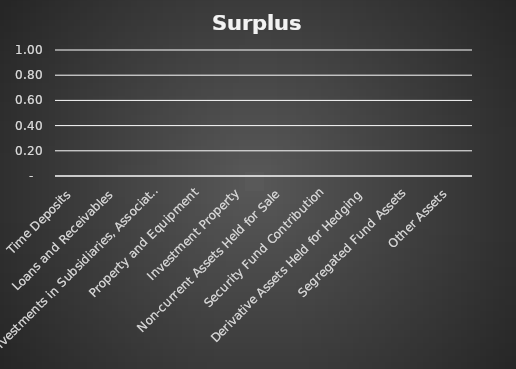
| Category | Series 3 |
|---|---|
| Time Deposits | 0 |
| Loans and Receivables | 0 |
| Investments in Subsidiaries, Associates and Joint Ventures | 0 |
| Property and Equipment | 0 |
| Investment Property | 0 |
| Non-current Assets Held for Sale | 0 |
| Security Fund Contribution | 0 |
| Derivative Assets Held for Hedging | 0 |
| Segregated Fund Assets | 0 |
| Other Assets | 0 |